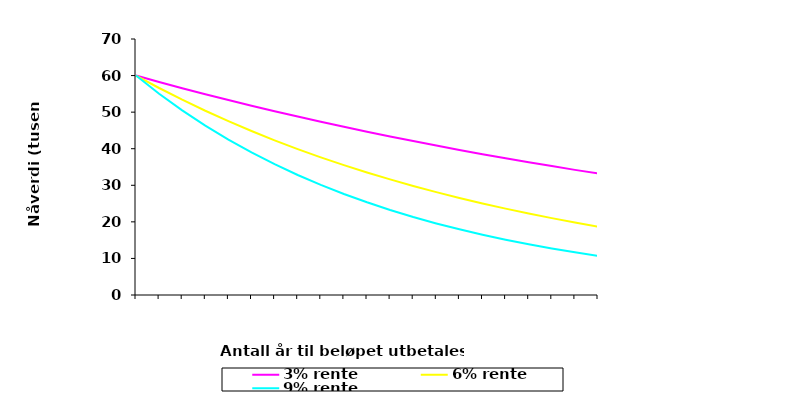
| Category | 3% rente | 6% rente | 9% rente |
|---|---|---|---|
| nan | 60 | 60 | 60 |
| 1.0 | 58.252 | 56.604 | 55.046 |
| 2.0 | 56.556 | 53.4 | 50.501 |
| 3.0 | 54.908 | 50.377 | 46.331 |
| 4.0 | 53.309 | 47.526 | 42.506 |
| 5.0 | 51.757 | 44.835 | 38.996 |
| 6.0 | 50.249 | 42.298 | 35.776 |
| 7.0 | 48.785 | 39.903 | 32.822 |
| 8.0 | 47.365 | 37.645 | 30.112 |
| 9.0 | 45.985 | 35.514 | 27.626 |
| 10.0 | 44.646 | 33.504 | 25.345 |
| 11.0 | 43.345 | 31.607 | 23.252 |
| 12.0 | 42.083 | 29.818 | 21.332 |
| 13.0 | 40.857 | 28.13 | 19.571 |
| 14.0 | 39.667 | 26.538 | 17.955 |
| 15.0 | 38.512 | 25.036 | 16.472 |
| 16.0 | 37.39 | 23.619 | 15.112 |
| 17.0 | 36.301 | 22.282 | 13.864 |
| 18.0 | 35.244 | 21.021 | 12.72 |
| 19.0 | 34.217 | 19.831 | 11.669 |
| 20.0 | 33.221 | 18.708 | 10.706 |